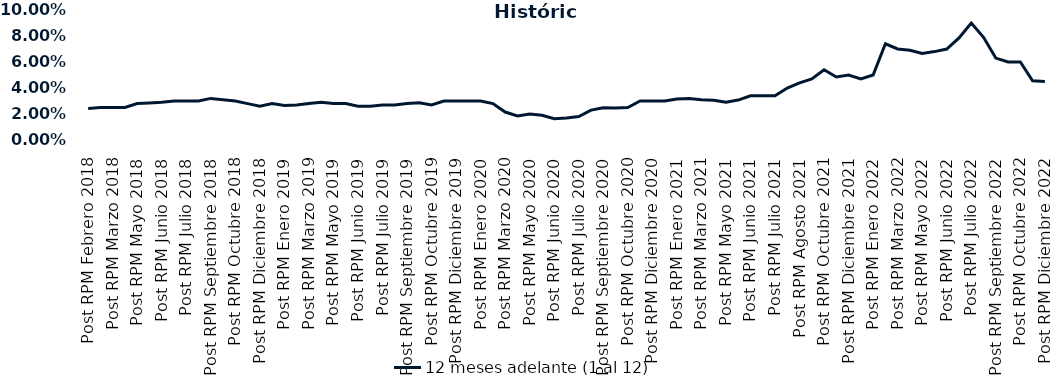
| Category | 12 meses adelante (1 al 12)  |
|---|---|
| Post RPM Febrero 2018 | 0.024 |
| Pre RPM Marzo 2018 | 0.025 |
| Post RPM Marzo 2018 | 0.025 |
| Pre RPM Mayo 2018 | 0.025 |
| Post RPM Mayo 2018 | 0.028 |
| Pre RPM Junio 2018 | 0.028 |
| Post RPM Junio 2018 | 0.029 |
| Pre RPM Julio 2018 | 0.03 |
| Post RPM Julio 2018 | 0.03 |
| Pre RPM Septiembre 2018 | 0.03 |
| Post RPM Septiembre 2018 | 0.032 |
| Pre RPM Octubre 2018 | 0.031 |
| Post RPM Octubre 2018 | 0.03 |
| Pre RPM Diciembre 2018 | 0.028 |
| Post RPM Diciembre 2018 | 0.026 |
| Pre RPM Enero 2019 | 0.028 |
| Post RPM Enero 2019 | 0.026 |
| Pre RPM Marzo 2019 | 0.027 |
| Post RPM Marzo 2019 | 0.028 |
| Pre RPM Mayo 2019 | 0.029 |
| Post RPM Mayo 2019 | 0.028 |
| Pre RPM Junio 2019 | 0.028 |
| Post RPM Junio 2019 | 0.026 |
| Pre RPM Julio 2019 | 0.026 |
| Post RPM Julio 2019 | 0.027 |
| Pre RPM Septiembre 2019 | 0.027 |
| Post RPM Septiembre 2019 | 0.028 |
| Pre RPM Octubre 2019 | 0.029 |
| Post RPM Octubre 2019 | 0.027 |
| Pre RPM Diciembre 2019 | 0.03 |
| Post RPM Diciembre 2019 | 0.03 |
| Pre RPM Enero 2020 | 0.03 |
| Post RPM Enero 2020 | 0.03 |
| Pre RPM Marzo 2020 | 0.028 |
| Post RPM Marzo 2020 | 0.022 |
| Pre RPM Mayo 2020 | 0.018 |
| Post RPM Mayo 2020 | 0.02 |
| Pre RPM Junio 2020 | 0.019 |
| Post RPM Junio 2020 | 0.016 |
| Pre RPM Julio 2020 | 0.017 |
| Post RPM Julio 2020 | 0.018 |
| Pre RPM Septiembre 2020 | 0.023 |
| Post RPM Septiembre 2020 | 0.025 |
| Pre RPM Octubre 2020 | 0.025 |
| Post RPM Octubre 2020 | 0.025 |
| Pre RPM Diciembre 2020 | 0.03 |
| Post RPM Diciembre 2020 | 0.03 |
| Pre RPM Enero 2021 | 0.03 |
| Post RPM Enero 2021 | 0.032 |
| Pre RPM Marzo 2021 | 0.032 |
| Post RPM Marzo 2021 | 0.031 |
| Pre RPM Mayo 2021 | 0.03 |
| Post RPM Mayo 2021 | 0.029 |
| Pre RPM Junio 2021 | 0.031 |
| Post RPM Junio 2021 | 0.034 |
| Pre RPM Julio 2021 | 0.034 |
| Post RPM Julio 2021 | 0.034 |
| Pre RPM Agosto 2021 | 0.04 |
| Post RPM Agosto 2021 | 0.044 |
| Pre RPM Octubre 2021 | 0.047 |
| Post RPM Octubre 2021 | 0.054 |
| Pre RPM Diciembre 2021 | 0.048 |
| Post RPM Diciembre 2021 | 0.05 |
| Pre RPM Enero 2022 | 0.047 |
| Post RPM Enero 2022 | 0.05 |
| Pre RPM Marzo 2022 | 0.074 |
| Post RPM Marzo 2022 | 0.07 |
| Pre RPM Mayo 2022 | 0.069 |
| Post RPM Mayo 2022 | 0.066 |
| Pre RPM Junio 2022 | 0.068 |
| Post RPM Junio 2022 | 0.07 |
| Pre RPM Julio 2022 | 0.078 |
| Post RPM Julio 2022 | 0.09 |
| Pre RPM Septiembre 2022 | 0.079 |
| Post RPM Septiembre 2022 | 0.063 |
| Pre RPM Octubre 2022 | 0.06 |
| Post RPM Octubre 2022 | 0.06 |
| Pre RPM Diciembre 2022 | 0.046 |
| Post RPM Diciembre 2022 | 0.045 |